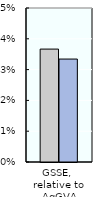
| Category | 2000-02 | 2018-20 |
|---|---|---|
| GSSE, 
relative to AgGVA | 0.037 | 0.033 |